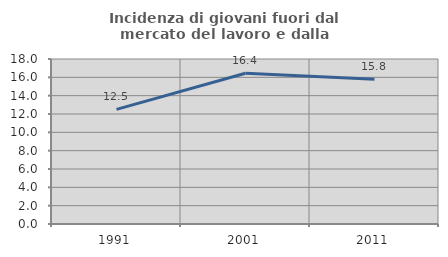
| Category | Incidenza di giovani fuori dal mercato del lavoro e dalla formazione  |
|---|---|
| 1991.0 | 12.5 |
| 2001.0 | 16.438 |
| 2011.0 | 15.789 |